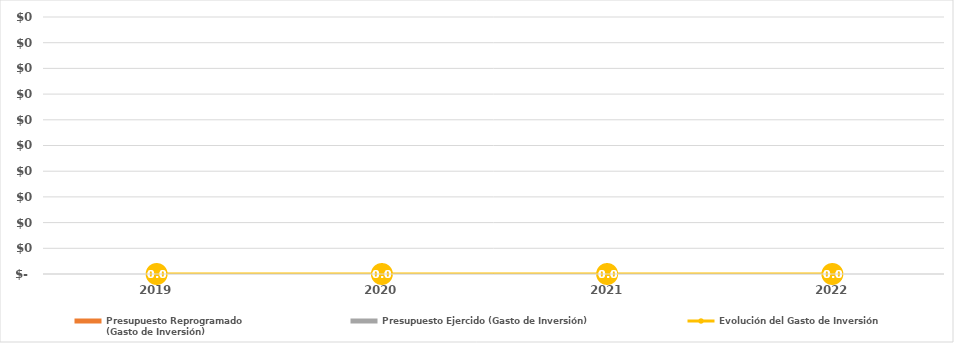
| Category | Presupuesto Reprogramado
(Gasto de Inversión) | Presupuesto Ejercido (Gasto de Inversión) |
|---|---|---|
| 2019.0 | 0 | 0 |
| 2020.0 | 0 | 0 |
| 2021.0 | 0 | 0 |
| 2022.0 | 0 | 0 |